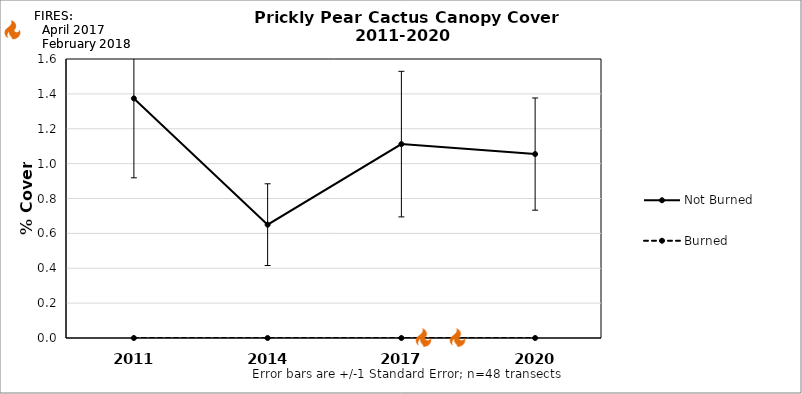
| Category | Not Burned | Burned |
|---|---|---|
| 2011.0 | 1.374 | 0 |
| 2014.0 | 0.65 | 0 |
| 2017.0 | 1.112 | 0 |
| 2020.0 | 1.055 | 0 |